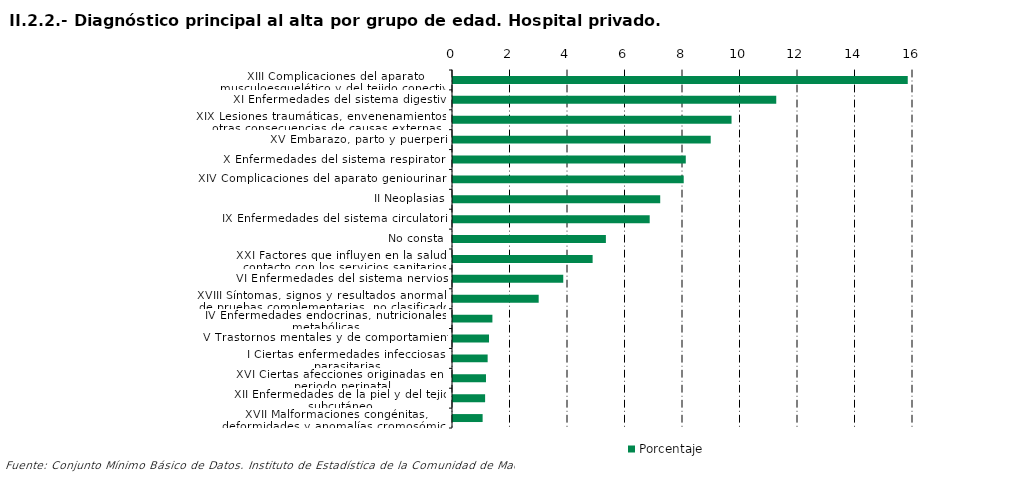
| Category | Porcentaje |
|---|---|
| XIII Complicaciones del aparato musculoesquelético y del tejido conectivo | 15.818 |
| XI Enfermedades del sistema digestivo | 11.244 |
| XIX Lesiones traumáticas, envenenamientos y otras consecuencias de causas externas | 9.688 |
| XV Embarazo, parto y puerperio | 8.963 |
| X Enfermedades del sistema respiratorio | 8.097 |
| XIV Complicaciones del aparato geniourinario | 8.025 |
| II Neoplasias | 7.207 |
| IX Enfermedades del sistema circulatorio | 6.842 |
| No consta | 5.318 |
| XXI Factores que influyen en la salud y contacto con los servicios sanitarios | 4.856 |
| VI Enfermedades del sistema nervioso | 3.835 |
| XVIII Síntomas, signos y resultados anormales de pruebas complementarias, no clasificados bajo otro concepto | 2.98 |
| IV Enfermedades endocrinas, nutricionales y metabólicas | 1.371 |
| V Trastornos mentales y de comportamiento | 1.252 |
| I Ciertas enfermedades infecciosas y parasitarias | 1.205 |
| XVI Ciertas afecciones originadas en el periodo perinatal | 1.147 |
| XII Enfermedades de la piel y del tejido subcutáneo | 1.117 |
| XVII Malformaciones congénitas, deformidades y anomalías cromosómicas | 1.03 |